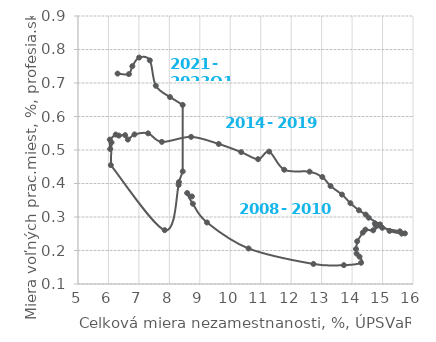
| Category | Series 0 |
|---|---|
| 8.74153333333333 | 0.361 |
| 8.58453333333333 | 0.372 |
| 8.7708 | 0.34 |
| 9.2349 | 0.284 |
| 10.6003333333333 | 0.206 |
| 12.73 | 0.16 |
| 13.7304666666666 | 0.156 |
| 14.2966 | 0.163 |
| 14.2428 | 0.181 |
| 14.1471666666666 | 0.191 |
| 14.1281333333333 | 0.204 |
| 14.1673333333333 | 0.228 |
| 14.3523333333333 | 0.254 |
| 14.4374333333333 | 0.262 |
| 14.6918666666666 | 0.26 |
| 14.8851 | 0.275 |
| 14.7750666666666 | 0.275 |
| 14.7461 | 0.281 |
| 14.9901333333333 | 0.268 |
| 15.5696333333333 | 0.257 |
| 15.7348333333333 | 0.251 |
| 15.6282666666666 | 0.25 |
| 15.2305 | 0.258 |
| 14.9169 | 0.278 |
| 14.5452 | 0.298 |
| 14.4484666666666 | 0.307 |
| 14.2252 | 0.32 |
| 13.9459666666666 | 0.341 |
| 13.6683666666666 | 0.367 |
| 13.2928333333333 | 0.392 |
| 13.0226333333333 | 0.419 |
| 12.604 | 0.435 |
| 11.7716666666666 | 0.441 |
| 11.2766333333333 | 0.495 |
| 10.9128333333333 | 0.473 |
| 10.3578666666666 | 0.494 |
| 9.62076666666666 | 0.518 |
| 8.71303333333333 | 0.539 |
| 7.7536 | 0.524 |
| 7.30296666666666 | 0.55 |
| 6.8555 | 0.546 |
| 6.63666666666666 | 0.531 |
| 6.54733333333333 | 0.544 |
| 6.34206666666666 | 0.543 |
| 6.23886666666666 | 0.546 |
| 6.044 | 0.531 |
| 6.05776666666666 | 0.503 |
| 6.0997 | 0.523 |
| 6.07783333333333 | 0.455 |
| 7.8466 | 0.261 |
| 8.30426666666666 | 0.396 |
| 8.31396666666666 | 0.404 |
| 8.43786666666666 | 0.436 |
| 8.43706666666666 | 0.635 |
| 8.02189999999999 | 0.658 |
| 7.55453333333333 | 0.692 |
| 7.3578 | 0.768 |
| 7.00703333333333 | 0.776 |
| 6.78486666666666 | 0.75 |
| 6.67096666666666 | 0.727 |
| 6.2998 | 0.728 |